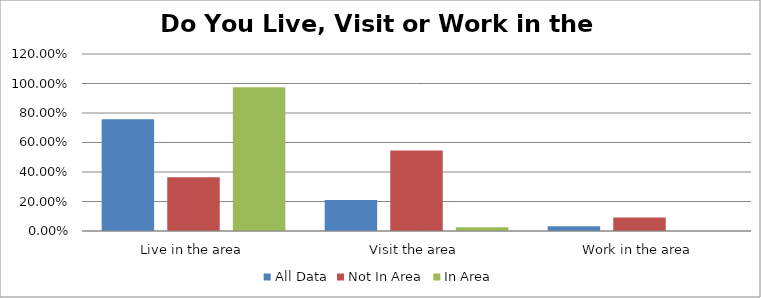
| Category | All Data | Not In Area | In Area |
|---|---|---|---|
| Live in the area | 0.758 | 0.364 | 0.975 |
| Visit the area | 0.21 | 0.545 | 0.025 |
| Work in the area | 0.032 | 0.091 | 0 |